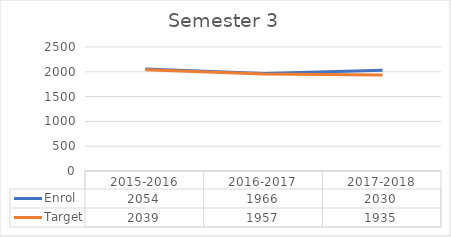
| Category | Enrol | Target |
|---|---|---|
| 2015-2016 | 2054 | 2039 |
| 2016-2017 | 1966 | 1957 |
| 2017-2018 | 2030 | 1935 |